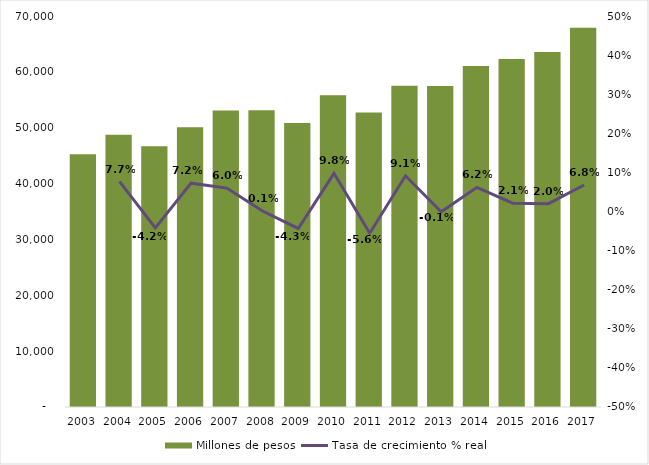
| Category | Millones de pesos |
|---|---|
| 2003.0 | 45266.923 |
| 2004.0 | 48731.225 |
| 2005.0 | 46693.767 |
| 2006.0 | 50078.72 |
| 2007.0 | 53074.537 |
| 2008.0 | 53142.478 |
| 2009.0 | 50839.069 |
| 2010.0 | 55802.037 |
| 2011.0 | 52703.563 |
| 2012.0 | 57514.461 |
| 2013.0 | 57476.853 |
| 2014.0 | 61028.816 |
| 2015.0 | 62317.327 |
| 2016.0 | 63570.982 |
| 2017.0 | 67880.882 |